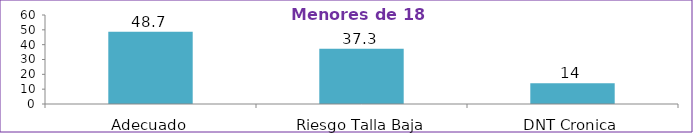
| Category | Series 0 |
|---|---|
| Adecuado | 48.7 |
| Riesgo Talla Baja | 37.3 |
| DNT Cronica | 14 |